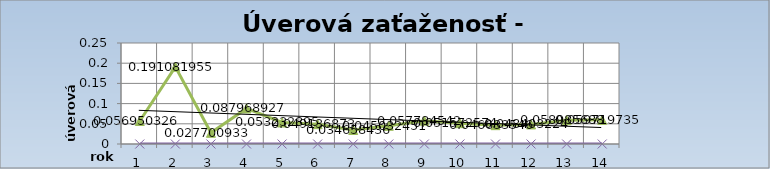
| Category | Series 2 | Series 3 |
|---|---|---|
| 0 | 0.057 |  |
| 1 | 0.191 |  |
| 2 | 0.028 |  |
| 3 | 0.088 |  |
| 4 | 0.053 |  |
| 5 | 0.049 |  |
| 6 | 0.035 |  |
| 7 | 0.045 |  |
| 8 | 0.058 |  |
| 9 | 0.052 |  |
| 10 | 0.047 |  |
| 11 | 0.048 |  |
| 12 | 0.059 |  |
| 13 | 0.06 |  |